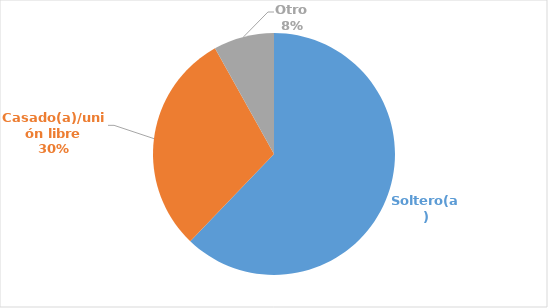
| Category | Series 0 |
|---|---|
| Soltero(a) | 0.622 |
| Casado(a)/unión libre | 0.297 |
| Otro | 0.081 |